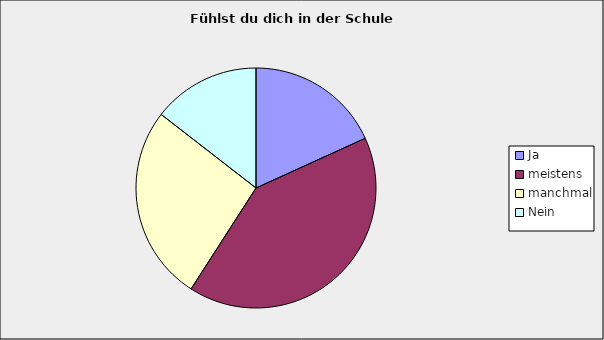
| Category | Series 0 |
|---|---|
| Ja | 0.182 |
| meistens | 0.409 |
| manchmal | 0.264 |
| Nein | 0.145 |